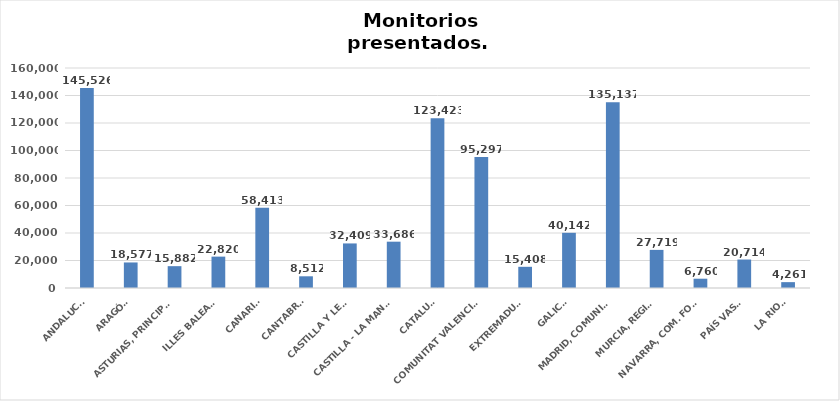
| Category | Series 0 |
|---|---|
| ANDALUCÍA | 145526 |
| ARAGÓN | 18577 |
| ASTURIAS, PRINCIPADO | 15882 |
| ILLES BALEARS | 22820 |
| CANARIAS | 58413 |
| CANTABRIA | 8512 |
| CASTILLA Y LEÓN | 32409 |
| CASTILLA - LA MANCHA | 33686 |
| CATALUÑA | 123423 |
| COMUNITAT VALENCIANA | 95297 |
| EXTREMADURA | 15408 |
| GALICIA | 40142 |
| MADRID, COMUNIDAD | 135137 |
| MURCIA, REGIÓN | 27719 |
| NAVARRA, COM. FORAL | 6760 |
| PAÍS VASCO | 20714 |
| LA RIOJA | 4261 |